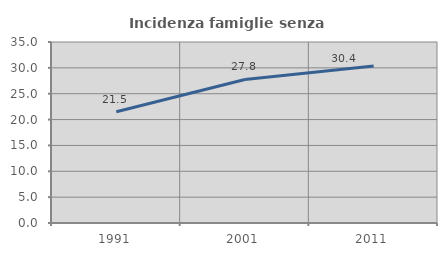
| Category | Incidenza famiglie senza nuclei |
|---|---|
| 1991.0 | 21.525 |
| 2001.0 | 27.761 |
| 2011.0 | 30.382 |